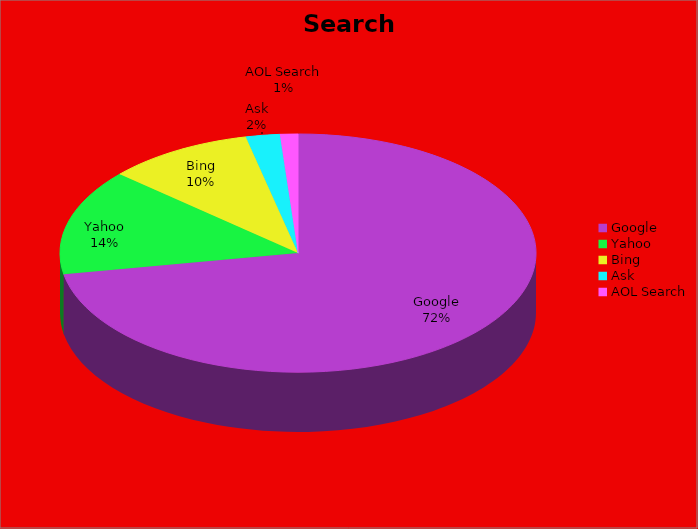
| Category | Series 0 | Series 1 | Series 2 |
|---|---|---|---|
| Google | 0.716 |  |  |
| Yahoo | 0.143 |  |  |
| Bing | 0.099 |  |  |
| Ask | 0.023 |  |  |
| AOL Search | 0.012 |  |  |